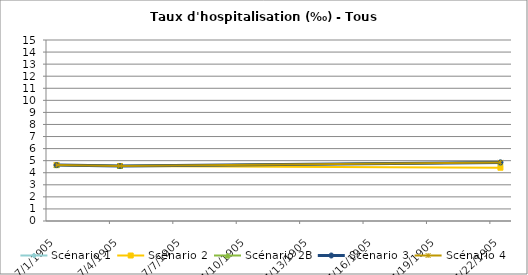
| Category | Scénario 1 | Scénario 2 | Scénario 2B | Scénario 3 | Scénario 4 |
|---|---|---|---|---|---|
| 2009.0 | 4.633 | 4.633 | 4.633 | 4.633 | 4.633 |
| 2012.0 | 4.559 | 4.559 | 4.559 | 4.559 | 4.559 |
| 2030.0 | 4.857 | 4.415 | 4.857 | 4.857 | 4.857 |